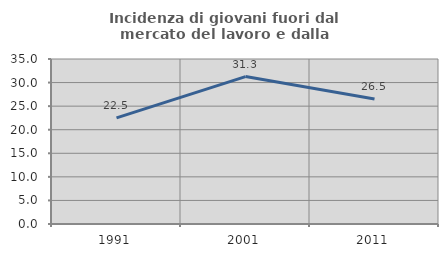
| Category | Incidenza di giovani fuori dal mercato del lavoro e dalla formazione  |
|---|---|
| 1991.0 | 22.511 |
| 2001.0 | 31.27 |
| 2011.0 | 26.53 |